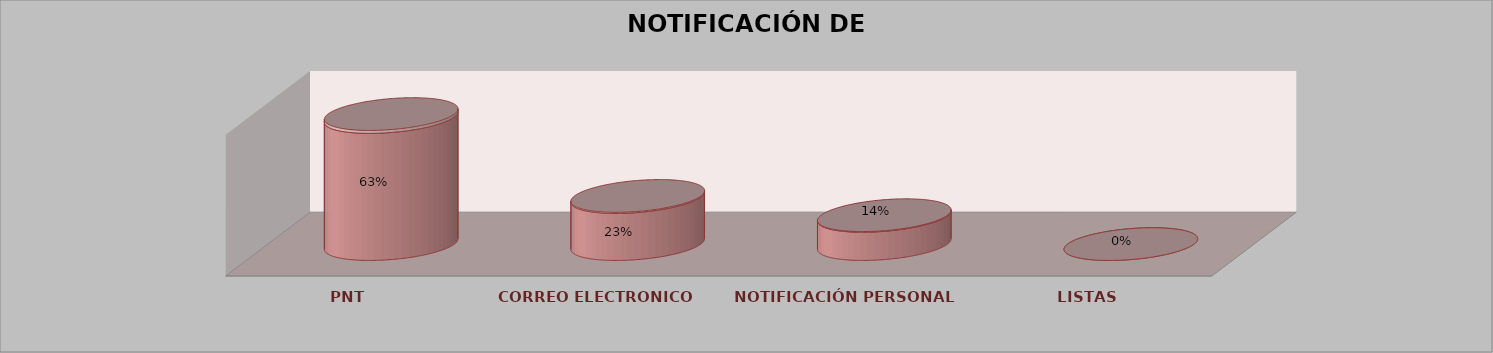
| Category | Series 0 | Series 1 | Series 2 | Series 3 | Series 4 |
|---|---|---|---|---|---|
| PNT |  |  |  | 27 | 0.628 |
| CORREO ELECTRONICO |  |  |  | 10 | 0.233 |
| NOTIFICACIÓN PERSONAL |  |  |  | 6 | 0.14 |
| LISTAS |  |  |  | 0 | 0 |